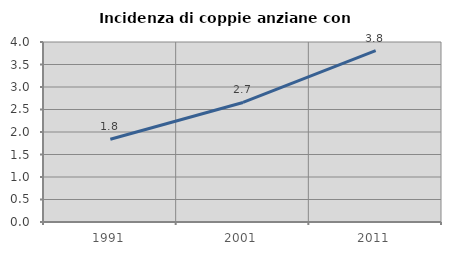
| Category | Incidenza di coppie anziane con figli |
|---|---|
| 1991.0 | 1.839 |
| 2001.0 | 2.656 |
| 2011.0 | 3.808 |